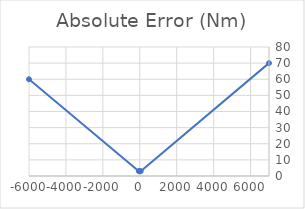
| Category | absolute error |
|---|---|
| -6000.0 | 60 |
| -50.0 | 3 |
| 0.0 | 3 |
| 50.0 | 3 |
| 7000.0 | 70 |